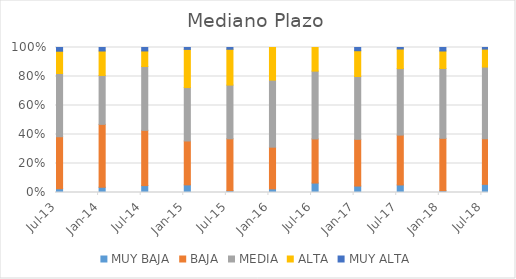
| Category | MUY BAJA | BAJA | MEDIA | ALTA | MUY ALTA |
|---|---|---|---|---|---|
| 2013-07-01 | 0.026 | 0.359 | 0.436 | 0.154 | 0.026 |
| 2014-01-01 | 0.036 | 0.434 | 0.337 | 0.169 | 0.024 |
| 2014-07-01 | 0.048 | 0.381 | 0.44 | 0.107 | 0.024 |
| 2015-01-01 | 0.048 | 0.274 | 0.333 | 0.238 | 0.012 |
| 2015-07-01 | 0.012 | 0.358 | 0.37 | 0.247 | 0.012 |
| 2016-01-01 | 0.025 | 0.288 | 0.462 | 0.225 | 0 |
| 2016-07-01 | 0.065 | 0.304 | 0.467 | 0.163 | 0 |
| 2017-01-01 | 0.044 | 0.322 | 0.433 | 0.178 | 0.022 |
| 2017-07-01 | 0.052 | 0.344 | 0.458 | 0.135 | 0.01 |
| 2018-01-01 | 0.012 | 0.361 | 0.482 | 0.12 | 0.024 |
| 2018-07-01 | 0.056 | 0.315 | 0.494 | 0.124 | 0.011 |